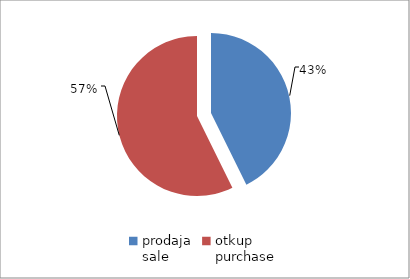
| Category | Series 0 |
|---|---|
| prodaja
sale | 138585591.6 |
| otkup
purchase | 185914314.4 |